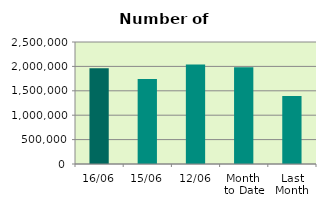
| Category | Series 0 |
|---|---|
| 16/06 | 1961204 |
| 15/06 | 1740892 |
| 12/06 | 2037924 |
| Month 
to Date | 1984400.833 |
| Last
Month | 1395416 |